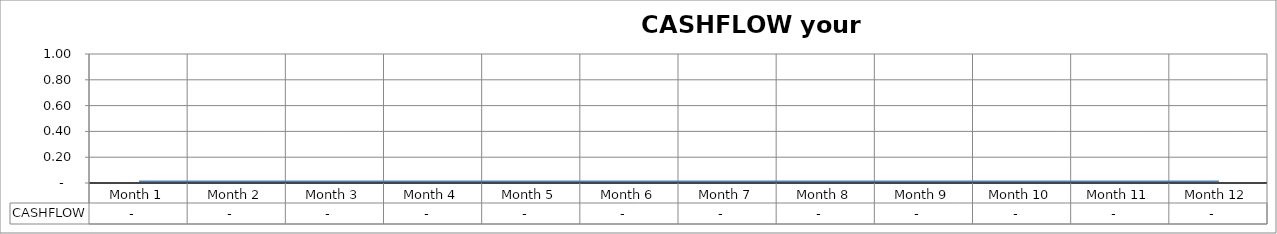
| Category | CASHFLOW |
|---|---|
| Month 1 | 0 |
| Month 2 | 0 |
| Month 3 | 0 |
| Month 4 | 0 |
| Month 5 | 0 |
| Month 6 | 0 |
| Month 7 | 0 |
| Month 8 | 0 |
| Month 9 | 0 |
| Month 10 | 0 |
| Month 11 | 0 |
| Month 12 | 0 |